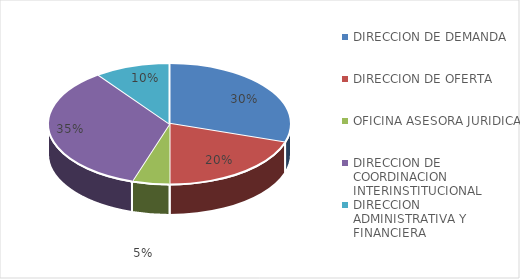
| Category | Series 0 |
|---|---|
| DIRECCION DE DEMANDA | 6 |
| DIRECCION DE OFERTA | 4 |
| OFICINA ASESORA JURIDICA | 1 |
| DIRECCION DE COORDINACION INTERINSTITUCIONAL | 7 |
| DIRECCION ADMINISTRATIVA Y FINANCIERA | 2 |